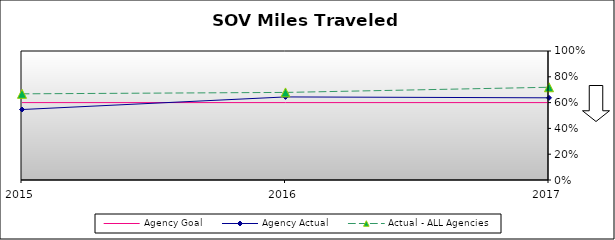
| Category | Agency Goal | Agency Actual | Actual - ALL Agencies |
|---|---|---|---|
| 2015.0 | 0.6 | 0.546 | 0.668 |
| 2016.0 | 0.6 | 0.644 | 0.679 |
| 2017.0 | 0.6 | 0.637 | 0.719 |